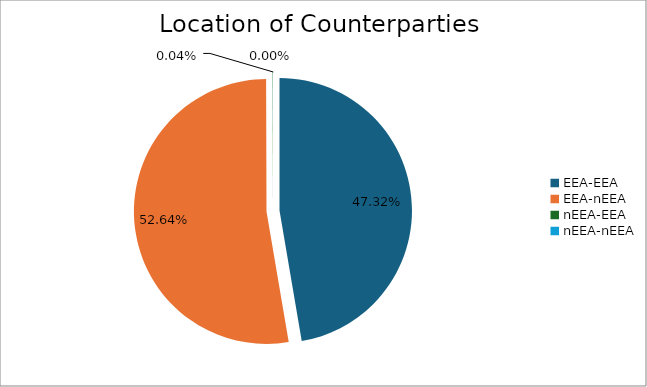
| Category | Series 0 |
|---|---|
| EEA-EEA | 6220389.301 |
| EEA-nEEA | 6919380.852 |
| nEEA-EEA | 5421.843 |
| nEEA-nEEA | 656.748 |